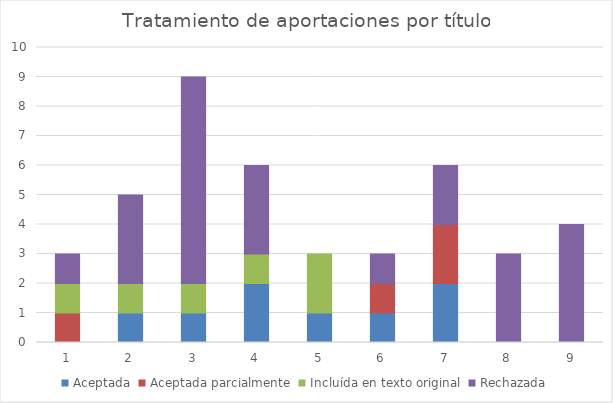
| Category | Aceptada | Aceptada parcialmente | Incluída en texto original | Rechazada |
|---|---|---|---|---|
| 0 | 0 | 1 | 1 | 1 |
| 1 | 1 | 0 | 1 | 3 |
| 2 | 1 | 0 | 1 | 7 |
| 3 | 2 | 0 | 1 | 3 |
| 4 | 1 | 0 | 2 | 0 |
| 5 | 1 | 1 | 0 | 1 |
| 6 | 2 | 2 | 0 | 2 |
| 7 | 0 | 0 | 0 | 3 |
| 8 | 0 | 0 | 0 | 4 |